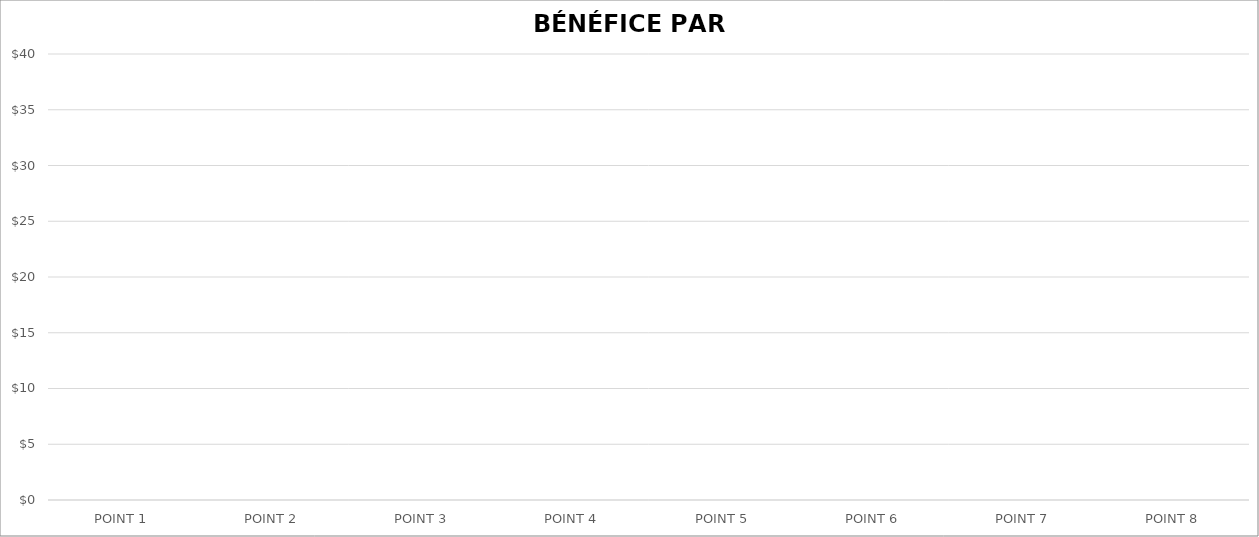
| Category | BÉNÉFICE PAR ARTICLE |
|---|---|
| POINT 1 | 0 |
| POINT 2 | 0 |
| POINT 3 | 0 |
| POINT 4 | 0 |
| POINT 5 | 0 |
| POINT 6 | 0 |
| POINT 7 | 0 |
| POINT 8 | 0 |